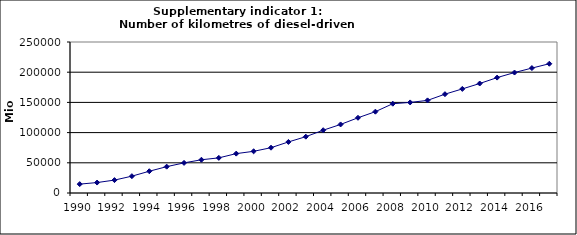
| Category | Number of kilometres of diesel-driven passenger cars, Mio km |
|---|---|
| 1990 | 14717.435 |
| 1991 | 17306.443 |
| 1992 | 21359.321 |
| 1993 | 27866.991 |
| 1994 | 36026.063 |
| 1995 | 43609.619 |
| 1996 | 49869.768 |
| 1997 | 55028.811 |
| 1998 | 58179.786 |
| 1999 | 65198.668 |
| 2000 | 68999.741 |
| 2001 | 75015.534 |
| 2002 | 84524.752 |
| 2003 | 93257.628 |
| 2004 | 103952.55 |
| 2005 | 113495.429 |
| 2006 | 124549.25 |
| 2007 | 134669.603 |
| 2008 | 147824.09 |
| 2009 | 149960.461 |
| 2010 | 153329.822 |
| 2011 | 163601.821 |
| 2012 | 172330.88 |
| 2013 | 181269.267 |
| 2014 | 191062.651 |
| 2015 | 199436.466 |
| 2016 | 206817.219 |
| 2017 | 213993.679 |